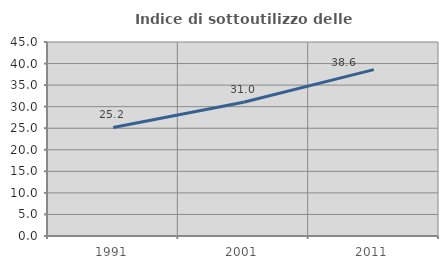
| Category | Indice di sottoutilizzo delle abitazioni  |
|---|---|
| 1991.0 | 25.179 |
| 2001.0 | 31.04 |
| 2011.0 | 38.589 |